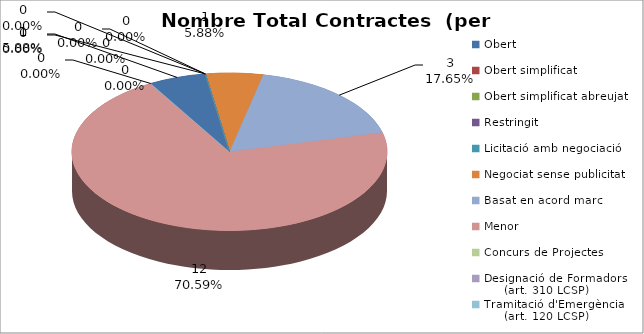
| Category | Nombre Total Contractes |
|---|---|
| Obert | 1 |
| Obert simplificat | 0 |
| Obert simplificat abreujat | 0 |
| Restringit | 0 |
| Licitació amb negociació | 0 |
| Negociat sense publicitat | 1 |
| Basat en acord marc | 3 |
| Menor | 12 |
| Concurs de Projectes | 0 |
| Designació de Formadors
     (art. 310 LCSP) | 0 |
| Tramitació d'Emergència
     (art. 120 LCSP) | 0 |